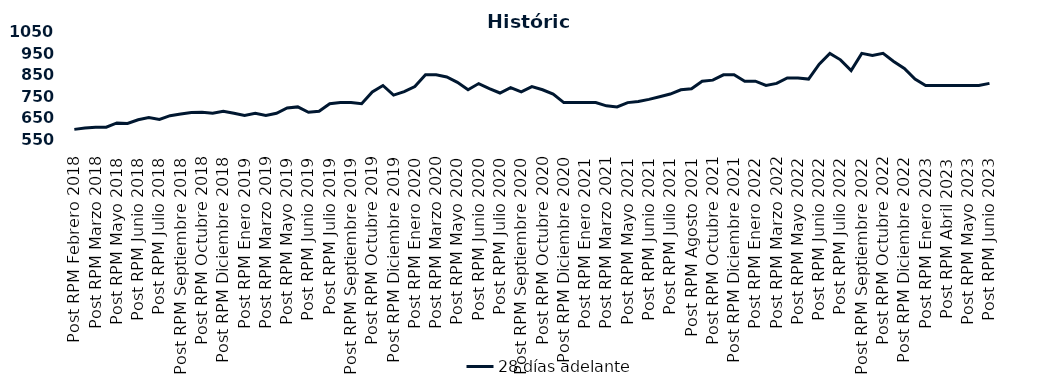
| Category | 28 días adelante |
|---|---|
| Post RPM Febrero 2018 | 595 |
| Pre RPM Marzo 2018 | 601 |
| Post RPM Marzo 2018 | 605 |
| Pre RPM Mayo 2018 | 605 |
| Post RPM Mayo 2018 | 625 |
| Pre RPM Junio 2018 | 623 |
| Post RPM Junio 2018 | 640 |
| Pre RPM Julio 2018 | 650 |
| Post RPM Julio 2018 | 641 |
| Pre RPM Septiembre 2018 | 659 |
| Post RPM Septiembre 2018 | 666.75 |
| Pre RPM Octubre 2018 | 674 |
| Post RPM Octubre 2018 | 675 |
| Pre RPM Diciembre 2018 | 670 |
| Post RPM Diciembre 2018 | 680 |
| Pre RPM Enero 2019 | 670 |
| Post RPM Enero 2019 | 660 |
| Pre RPM Marzo 2019 | 670 |
| Post RPM Marzo 2019 | 660 |
| Pre RPM Mayo 2019 | 670 |
| Post RPM Mayo 2019 | 695 |
| Pre RPM Junio 2019 | 700 |
| Post RPM Junio 2019 | 675 |
| Pre RPM Julio 2019 | 680 |
| Post RPM Julio 2019 | 715 |
| Pre RPM Septiembre 2019 | 720 |
| Post RPM Septiembre 2019 | 720 |
| Pre RPM Octubre 2019 | 715 |
| Post RPM Octubre 2019 | 770 |
| Pre RPM Diciembre 2019 | 800 |
| Post RPM Diciembre 2019 | 755 |
| Pre RPM Enero 2020 | 771 |
| Post RPM Enero 2020 | 795 |
| Pre RPM Marzo 2020 | 850 |
| Post RPM Marzo 2020 | 850 |
| Pre RPM Mayo 2020 | 840 |
| Post RPM Mayo 2020 | 815 |
| Pre RPM Junio 2020 | 780 |
| Post RPM Junio 2020 | 809 |
| Pre RPM Julio 2020 | 785.72 |
| Post RPM Julio 2020 | 765 |
| Pre RPM Septiembre 2020 | 790 |
| Post RPM Septiembre 2020 | 770 |
| Pre RPM Octubre 2020 | 795 |
| Post RPM Octubre 2020 | 780 |
| Pre RPM Diciembre 2020 | 760 |
| Post RPM Diciembre 2020 | 720 |
| Pre RPM Enero 2021 | 720 |
| Post RPM Enero 2021 | 720 |
| Pre RPM Marzo 2021 | 720 |
| Post RPM Marzo 2021 | 705 |
| Pre RPM Mayo 2021 | 700 |
| Post RPM Mayo 2021 | 720 |
| Pre RPM Junio 2021 | 725 |
| Post RPM Junio 2021 | 735 |
| Pre RPM Julio 2021 | 747.5 |
| Post RPM Julio 2021 | 760 |
| Pre RPM Agosto 2021 | 780 |
| Post RPM Agosto 2021 | 785 |
| Pre RPM Octubre 2021 | 820 |
| Post RPM Octubre 2021 | 825 |
| Pre RPM Diciembre 2021 | 850 |
| Post RPM Diciembre 2021 | 850 |
| Pre RPM Enero 2022 | 820 |
| Post RPM Enero 2022 | 820 |
| Pre RPM Marzo 2022 | 800 |
| Post RPM Marzo 2022 | 810 |
| Pre RPM Mayo 2022 | 835 |
| Post RPM Mayo 2022 | 835 |
| Pre RPM Junio 2022 | 830 |
| Post RPM Junio 2022 | 900 |
| Pre RPM Julio 2022 | 950 |
| Post RPM Julio 2022 | 920 |
| Pre RPM Septiembre 2022 | 870 |
| Post RPM Septiembre 2022 | 950 |
| Pre RPM Octubre 2022 | 940 |
| Post RPM Octubre 2022 | 950 |
| Pre RPM Diciembre 2022 | 912.5 |
| Post RPM Diciembre 2022 | 880 |
| Pre RPM Enero 2023 | 830 |
| Post RPM Enero 2023 | 800 |
| Pre RPM Abril 2023 | 800 |
| Post RPM Abril 2023 | 800 |
| Pre RPM Mayo 2023 | 800 |
| Post RPM Mayo 2023 | 800 |
| Pre RPM Junio 2023 | 800 |
| Post RPM Junio 2023 | 810 |